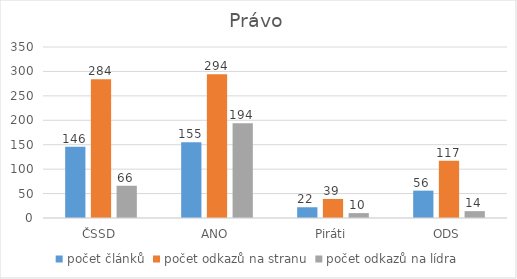
| Category | počet článků | počet odkazů na stranu | počet odkazů na lídra |
|---|---|---|---|
| ČSSD | 146 | 284 | 66 |
| ANO | 155 | 294 | 194 |
| Piráti | 22 | 39 | 10 |
| ODS | 56 | 117 | 14 |